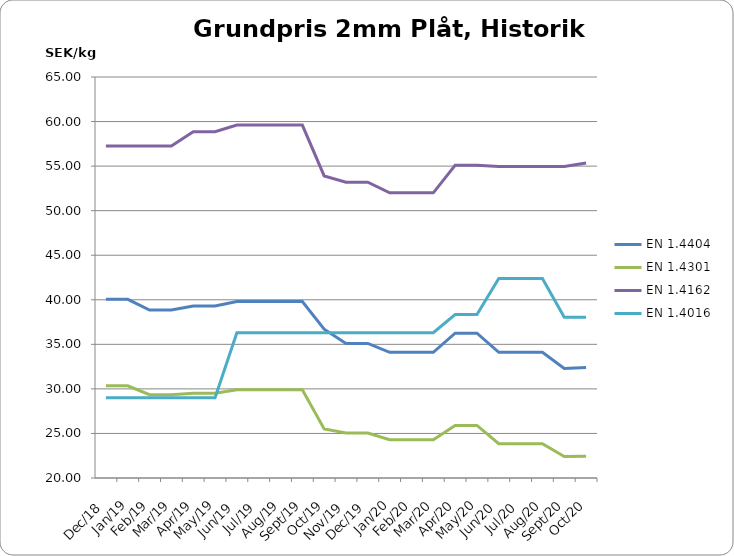
| Category | EN 1.4404 | EN 1.4301 | EN 1.4162  | EN 1.4016 |
|---|---|---|---|---|
| 2018-12-15 | 40.05 | 30.35 | 57.25 | 29 |
| 2019-01-15 | 40.05 | 30.35 | 57.25 | 29 |
| 2019-02-15 | 38.85 | 29.35 | 57.25 | 29 |
| 2019-03-15 | 38.85 | 29.35 | 57.25 | 29 |
| 2019-04-15 | 39.3 | 29.5 | 58.85 | 29 |
| 2019-05-15 | 39.3 | 29.5 | 58.85 | 29 |
| 2019-06-15 | 39.8 | 29.9 | 59.6 | 36.29 |
| 2019-07-15 | 39.8 | 29.9 | 59.6 | 36.29 |
| 2019-08-15 | 39.8 | 29.9 | 59.6 | 36.29 |
| 2019-09-15 | 39.8 | 29.9 | 59.6 | 36.29 |
| 2019-10-15 | 36.7 | 25.5 | 53.9 | 36.3 |
| 2019-11-15 | 35.1 | 25.05 | 53.2 | 36.3 |
| 2019-12-15 | 35.1 | 25.05 | 53.2 | 36.3 |
| 2020-01-15 | 34.1 | 24.3 | 52 | 36.3 |
| 2020-02-15 | 34.1 | 24.3 | 52 | 36.3 |
| 2020-03-15 | 34.1 | 24.3 | 52 | 36.3 |
| 2020-04-26 | 36.25 | 25.9 | 55.1 | 38.35 |
| 2020-05-26 | 36.25 | 25.9 | 55.1 | 38.35 |
| 2020-06-26 | 34.1 | 23.85 | 54.95 | 42.4 |
| 2020-07-26 | 34.1 | 23.85 | 54.95 | 42.4 |
| 2020-08-26 | 34.1 | 23.85 | 54.95 | 42.4 |
| 2020-09-26 | 32.3 | 22.4 | 54.95 | 38.05 |
| 2020-10-26 | 32.4 | 22.45 | 55.35 | 38.05 |